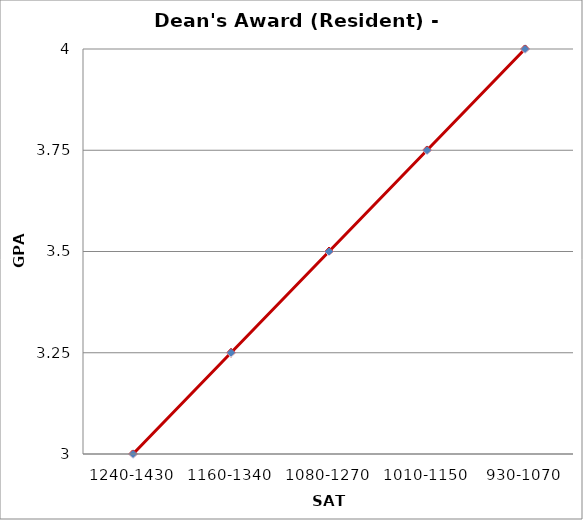
| Category | Dean's Award - $2750 |
|---|---|
| 1240-1430 | 3 |
| 1160-1340 | 3.25 |
| 1080-1270 | 3.5 |
| 1010-1150 | 3.75 |
| 930-1070 | 4 |